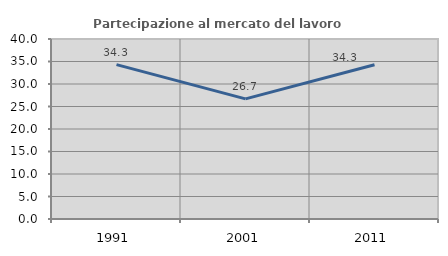
| Category | Partecipazione al mercato del lavoro  femminile |
|---|---|
| 1991.0 | 34.295 |
| 2001.0 | 26.7 |
| 2011.0 | 34.281 |